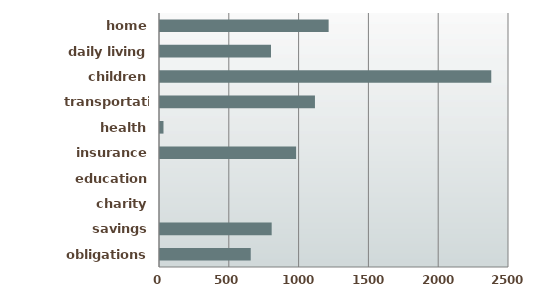
| Category | Expenses |
|---|---|
| obligations | 650 |
| savings | 800 |
| charity | 0 |
| education | 0 |
| insurance | 975 |
| health | 25 |
| transportation | 1110 |
| children | 2373 |
| daily living | 795 |
| home | 1208 |